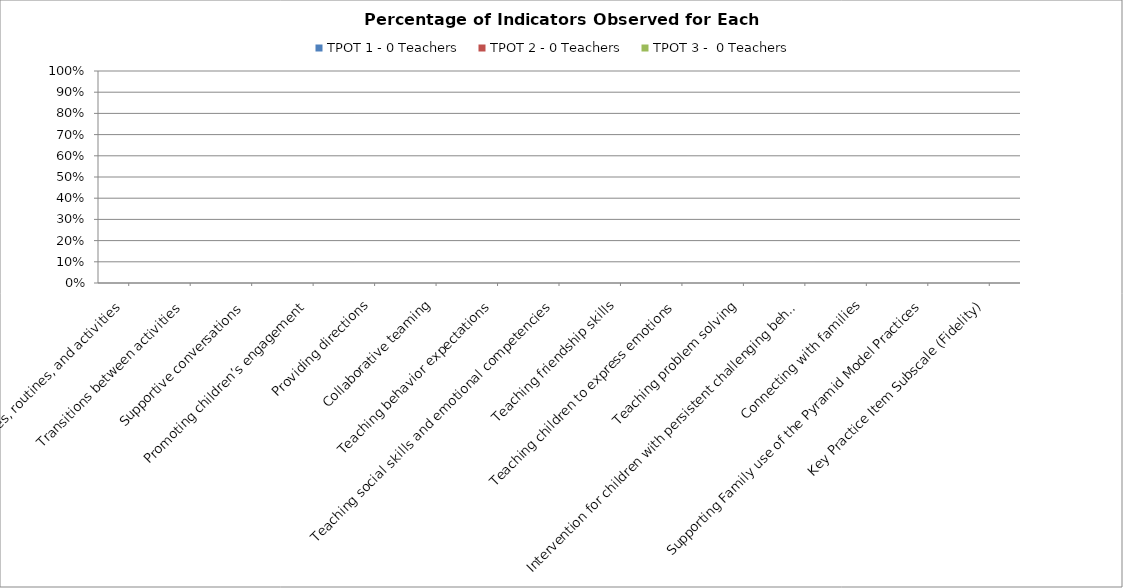
| Category | TPOT 1 - 0 Teachers | TPOT 2 - 0 Teachers | TPOT 3 -  0 Teachers |
|---|---|---|---|
| Schedules, routines, and activities | 0 | 0 | 0 |
| Transitions between activities  | 0 | 0 | 0 |
| Supportive conversations  | 0 | 0 | 0 |
| Promoting children’s engagement | 0 | 0 | 0 |
| Providing directions | 0 | 0 | 0 |
| Collaborative teaming | 0 | 0 | 0 |
| Teaching behavior expectations | 0 | 0 | 0 |
| Teaching social skills and emotional competencies | 0 | 0 | 0 |
| Teaching friendship skills | 0 | 0 | 0 |
| Teaching children to express emotions | 0 | 0 | 0 |
| Teaching problem solving | 0 | 0 | 0 |
| Intervention for children with persistent challenging behavior | 0 | 0 | 0 |
| Connecting with families | 0 | 0 | 0 |
| Supporting Family use of the Pyramid Model Practices | 0 | 0 | 0 |
| Key Practice Item Subscale (Fidelity) | 0 | 0 | 0 |